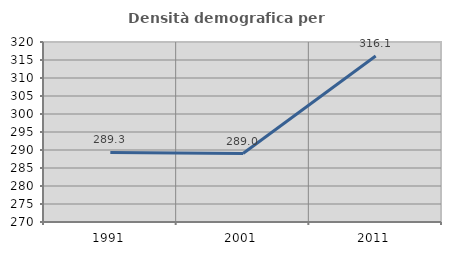
| Category | Densità demografica |
|---|---|
| 1991.0 | 289.337 |
| 2001.0 | 289.005 |
| 2011.0 | 316.094 |